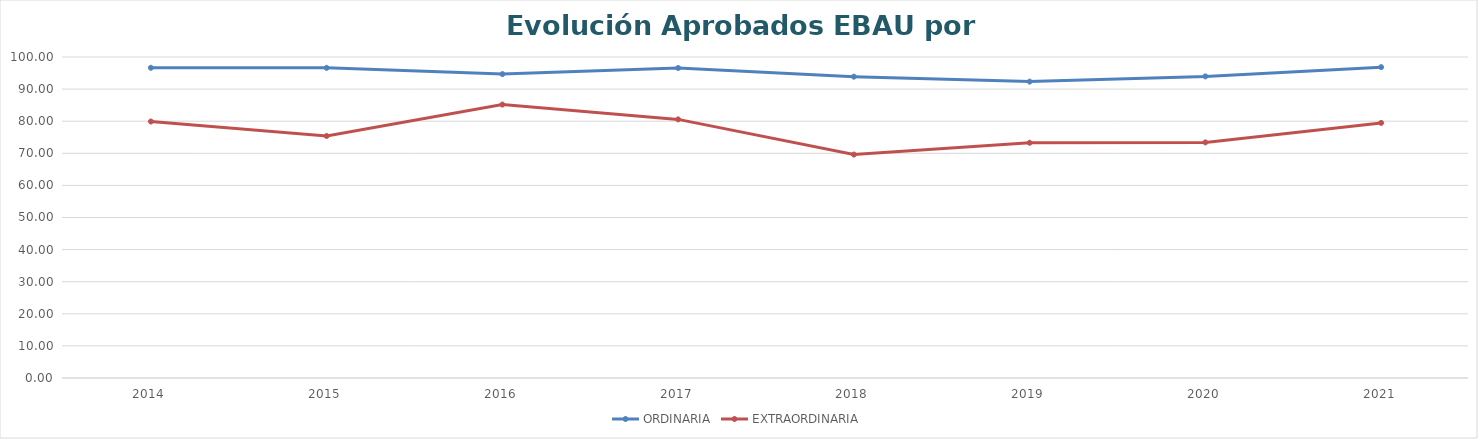
| Category | ORDINARIA | EXTRAORDINARIA |
|---|---|---|
| 2014.0 | 96.642 | 79.903 |
| 2015.0 | 96.623 | 75.393 |
| 2016.0 | 94.672 | 85.185 |
| 2017.0 | 96.573 | 80.564 |
| 2018.0 | 93.872 | 69.61 |
| 2019.0 | 92.334 | 73.282 |
| 2020.0 | 93.959 | 73.399 |
| 2021.0 | 96.844 | 79.474 |